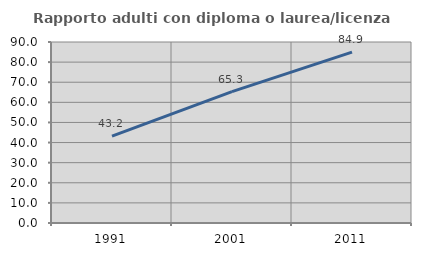
| Category | Rapporto adulti con diploma o laurea/licenza media  |
|---|---|
| 1991.0 | 43.2 |
| 2001.0 | 65.306 |
| 2011.0 | 84.946 |